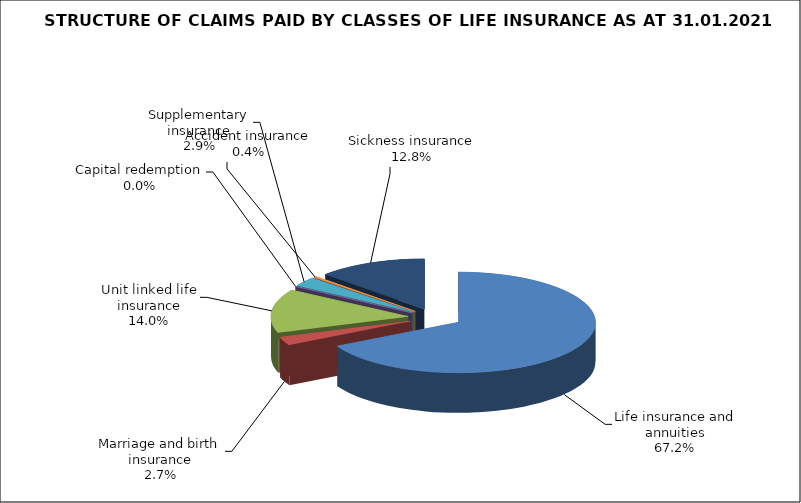
| Category | 12 182 550 |
|---|---|
| Life insurance and annuities | 12182549.574 |
| Marriage and birth insurance | 483510.598 |
| Unit linked life insurance | 2542227.073 |
| Capital redemption | 0 |
| Supplementary insurance | 534341.946 |
| Accident insurance | 67930.978 |
| Sickness insurance | 2329382.117 |